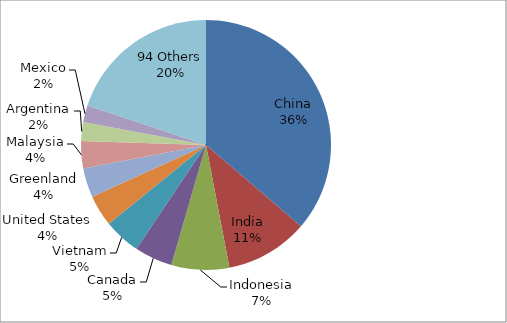
| Category | Series 0 |
|---|---|
| China | 1161822 |
| India | 343480 |
| Indonesia | 239419 |
| Canada | 158023 |
| Vietnam | 152500 |
| United States | 129737.5 |
| Greenland | 121019 |
| Malaysia | 112565 |
| Argentina | 77650.5 |
| Mexico | 69819.9 |
| 94 Others | 636952 |